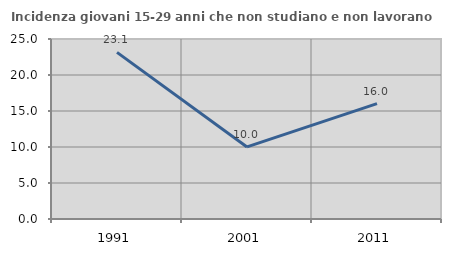
| Category | Incidenza giovani 15-29 anni che non studiano e non lavorano  |
|---|---|
| 1991.0 | 23.139 |
| 2001.0 | 10.012 |
| 2011.0 | 16.016 |